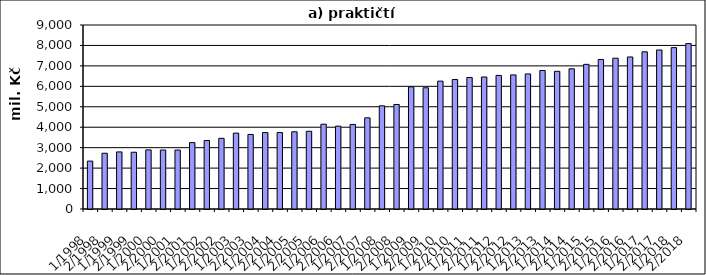
| Category | Series 0 |
|---|---|
| 1/1998 | 2343704.187 |
| 2/1998 | 2727032.041 |
| 1/1999 | 2792551.845 |
| 2/1999 | 2776224.155 |
| 1/2000 | 2890854.268 |
| 2/2000 | 2885728.562 |
| 1/2001 | 2884170.173 |
| 2/2001 | 3247560.679 |
| 1/2002 | 3349266 |
| 2/2002 | 3454864 |
| 1/2003 | 3712663 |
| 2/2003 | 3646227.323 |
| 1/2004 | 3737316.335 |
| 2/2004 | 3739897.456 |
| 1/2005 | 3777462 |
| 2/2005 | 3802261.527 |
| 1/2006 | 4147202 |
| 2/2006 | 4052407 |
| 1/2007 | 4135770 |
| 2/2007 | 4458210 |
| 1/2008 | 5046621.814 |
| 2/2008 | 5112480.186 |
| 1/2009 | 5975310 |
| 2/2009 | 5930324 |
| 1/2010 | 6254334 |
| 2/2010 | 6333049 |
| 1/2011 | 6432288 |
| 2/2011 | 6456330 |
| 1/2012 | 6534462 |
| 2/2012 | 6559277 |
| 1/2013 | 6605558 |
| 2/2013 | 6773896 |
| 1/2014 | 6734357 |
| 2/2014 | 6856240 |
| 1/2015 | 7074846 |
| 2/2015 | 7313903 |
| 1/2016 | 7375957 |
| 2/2016 | 7436958 |
| 1/2017 | 7687911 |
| 2/2017 | 7778659 |
| 1/2018 | 7893035.649 |
| 2/2018 | 8089533.915 |